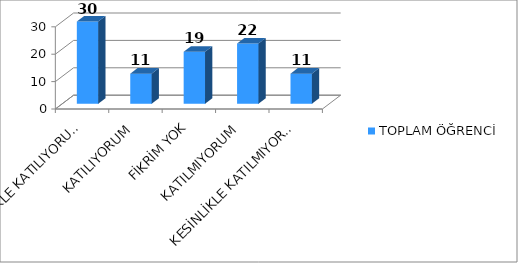
| Category | TOPLAM ÖĞRENCİ |
|---|---|
| KESİNLİKLE KATILIYORUM | 30 |
| KATILIYORUM | 11 |
| FİKRİM YOK | 19 |
| KATILMIYORUM | 22 |
| KESİNLİKLE KATILMIYORUM | 11 |